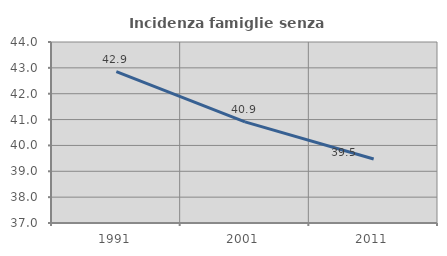
| Category | Incidenza famiglie senza nuclei |
|---|---|
| 1991.0 | 42.857 |
| 2001.0 | 40.909 |
| 2011.0 | 39.474 |